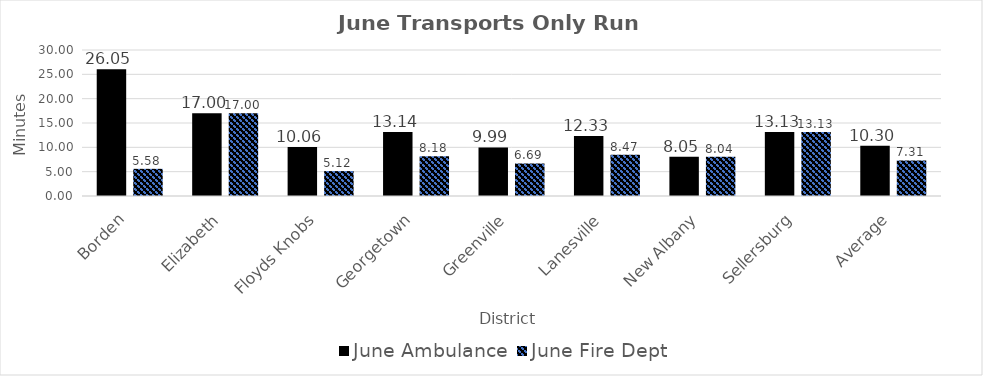
| Category | June |
|---|---|
| Borden | 5.583 |
| Elizabeth | 17 |
| Floyds Knobs | 5.118 |
| Georgetown | 8.175 |
| Greenville | 6.687 |
| Lanesville | 8.467 |
| New Albany | 8.041 |
| Sellersburg | 13.128 |
| Average | 7.308 |